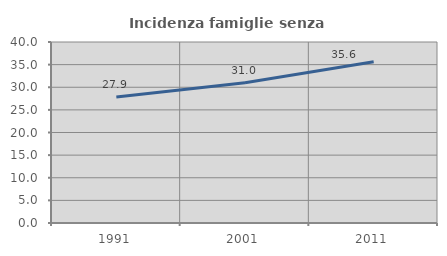
| Category | Incidenza famiglie senza nuclei |
|---|---|
| 1991.0 | 27.861 |
| 2001.0 | 30.992 |
| 2011.0 | 35.632 |